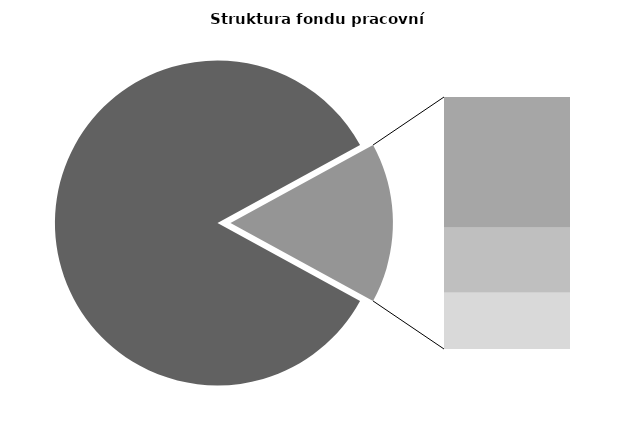
| Category | Series 0 |
|---|---|
| Průměrná měsíční odpracovaná doba bez přesčasu | 142.999 |
| Dovolená | 14.073 |
| Nemoc | 6.984 |
| Jiné | 6.052 |